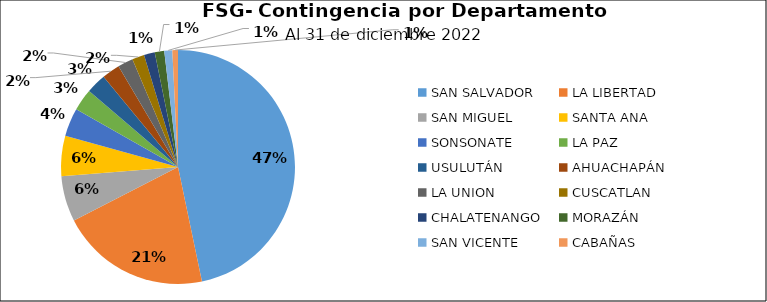
| Category | Saldo | Créditos |
|---|---|---|
| SAN SALVADOR | 64.145 | 7888 |
| LA LIBERTAD | 28.477 | 3493 |
| SAN MIGUEL | 8.617 | 1579 |
| SANTA ANA | 7.66 | 1669 |
| SONSONATE | 5.37 | 1116 |
| LA PAZ | 4.175 | 1409 |
| USULUTÁN | 3.798 | 1150 |
| AHUACHAPÁN | 3.409 | 1020 |
| LA UNION | 2.912 | 769 |
| CUSCATLAN | 2.306 | 831 |
| CHALATENANGO | 2.054 | 532 |
| MORAZÁN | 1.794 | 641 |
| SAN VICENTE | 1.526 | 584 |
| CABAÑAS | 1.063 | 438 |